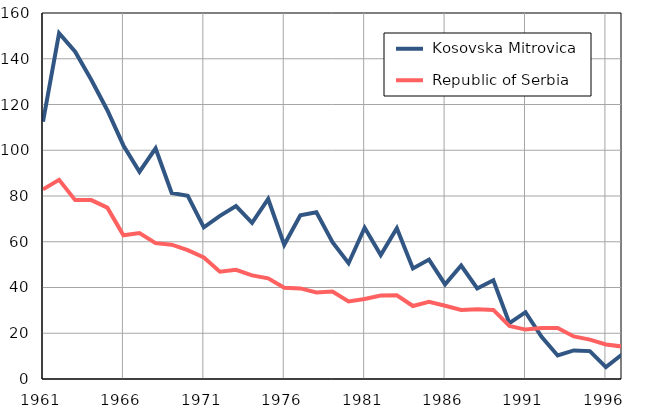
| Category |  Kosovska Mitrovica |  Republic of Serbia |
|---|---|---|
| 1961.0 | 112.5 | 82.9 |
| 1962.0 | 151.2 | 87.1 |
| 1963.0 | 143.1 | 78.2 |
| 1964.0 | 130.8 | 78.2 |
| 1965.0 | 117.5 | 74.9 |
| 1966.0 | 102.1 | 62.8 |
| 1967.0 | 90.6 | 63.8 |
| 1968.0 | 100.8 | 59.4 |
| 1969.0 | 81.3 | 58.7 |
| 1970.0 | 80.1 | 56.3 |
| 1971.0 | 66.3 | 53.1 |
| 1972.0 | 71.3 | 46.9 |
| 1973.0 | 75.6 | 47.7 |
| 1974.0 | 68.3 | 45.3 |
| 1975.0 | 78.7 | 44 |
| 1976.0 | 58.7 | 39.9 |
| 1977.0 | 71.6 | 39.6 |
| 1978.0 | 72.9 | 37.8 |
| 1979.0 | 59.8 | 38.2 |
| 1980.0 | 50.6 | 33.9 |
| 1981.0 | 66.1 | 35 |
| 1982.0 | 54.2 | 36.5 |
| 1983.0 | 65.9 | 36.6 |
| 1984.0 | 48.3 | 31.9 |
| 1985.0 | 52.2 | 33.7 |
| 1986.0 | 41.4 | 32 |
| 1987.0 | 49.6 | 30.2 |
| 1988.0 | 39.6 | 30.5 |
| 1989.0 | 43.2 | 30.2 |
| 1990.0 | 24.4 | 23.2 |
| 1991.0 | 29.2 | 21.6 |
| 1992.0 | 18.4 | 22.3 |
| 1993.0 | 10.3 | 22.3 |
| 1994.0 | 12.5 | 18.6 |
| 1995.0 | 12.2 | 17.2 |
| 1996.0 | 5.2 | 15.1 |
| 1997.0 | 10.7 | 14.2 |